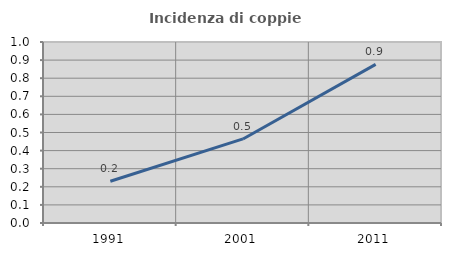
| Category | Incidenza di coppie miste |
|---|---|
| 1991.0 | 0.23 |
| 2001.0 | 0.464 |
| 2011.0 | 0.876 |